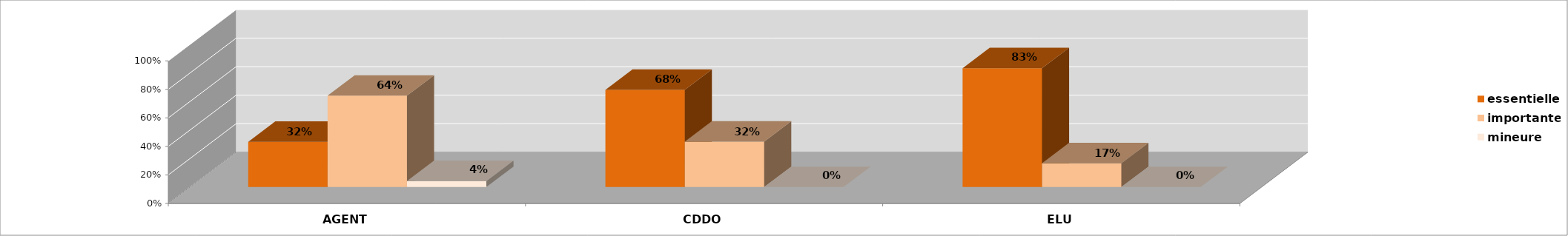
| Category | essentielle | importante | mineure |
|---|---|---|---|
| AGENT | 0.317 | 0.641 | 0.042 |
| CDDO | 0.682 | 0.318 | 0 |
| ELU | 0.833 | 0.167 | 0 |